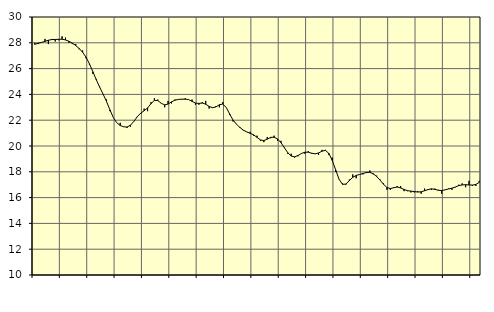
| Category | Piggar | Tillverkning o utvinning, energi o miljö, SNI 05-33, 35-39 |
|---|---|---|
| nan | 28 | 27.88 |
| 87.0 | 27.9 | 27.97 |
| 87.0 | 28 | 28.03 |
| 87.0 | 28.3 | 28.11 |
| nan | 27.9 | 28.2 |
| 88.0 | 28.3 | 28.25 |
| 88.0 | 28.1 | 28.26 |
| 88.0 | 28.2 | 28.27 |
| nan | 28.5 | 28.28 |
| 89.0 | 28.4 | 28.22 |
| 89.0 | 28 | 28.12 |
| 89.0 | 27.9 | 27.97 |
| nan | 27.9 | 27.79 |
| 90.0 | 27.5 | 27.56 |
| 90.0 | 27.4 | 27.27 |
| 90.0 | 26.8 | 26.89 |
| nan | 26.3 | 26.37 |
| 91.0 | 25.6 | 25.76 |
| 91.0 | 25.2 | 25.14 |
| 91.0 | 24.6 | 24.56 |
| nan | 24 | 24.02 |
| 92.0 | 23.6 | 23.45 |
| 92.0 | 22.7 | 22.8 |
| 92.0 | 22.2 | 22.2 |
| nan | 21.8 | 21.8 |
| 93.0 | 21.8 | 21.59 |
| 93.0 | 21.5 | 21.49 |
| 93.0 | 21.4 | 21.47 |
| nan | 21.5 | 21.61 |
| 94.0 | 21.9 | 21.91 |
| 94.0 | 22.3 | 22.27 |
| 94.0 | 22.5 | 22.55 |
| nan | 22.9 | 22.73 |
| 95.0 | 22.7 | 22.95 |
| 95.0 | 23.4 | 23.28 |
| 95.0 | 23.7 | 23.54 |
| nan | 23.6 | 23.52 |
| 96.0 | 23.3 | 23.31 |
| 96.0 | 23 | 23.19 |
| 96.0 | 23.5 | 23.25 |
| nan | 23.3 | 23.42 |
| 97.0 | 23.6 | 23.55 |
| 97.0 | 23.6 | 23.61 |
| 97.0 | 23.6 | 23.63 |
| nan | 23.7 | 23.63 |
| 98.0 | 23.6 | 23.6 |
| 98.0 | 23.6 | 23.46 |
| 98.0 | 23.2 | 23.33 |
| nan | 23.2 | 23.3 |
| 99.0 | 23.4 | 23.33 |
| 99.0 | 23.5 | 23.24 |
| 99.0 | 22.9 | 23.07 |
| nan | 23 | 22.97 |
| 0.0 | 23.1 | 23.03 |
| 0.0 | 23 | 23.2 |
| 0.0 | 23.4 | 23.25 |
| nan | 23 | 22.99 |
| 1.0 | 22.4 | 22.48 |
| 1.0 | 21.9 | 22.01 |
| 1.0 | 21.7 | 21.69 |
| nan | 21.4 | 21.44 |
| 2.0 | 21.2 | 21.23 |
| 2.0 | 21.1 | 21.09 |
| 2.0 | 21.1 | 20.98 |
| nan | 20.8 | 20.87 |
| 3.0 | 20.8 | 20.67 |
| 3.0 | 20.4 | 20.47 |
| 3.0 | 20.3 | 20.42 |
| nan | 20.7 | 20.53 |
| 4.0 | 20.6 | 20.67 |
| 4.0 | 20.8 | 20.68 |
| 4.0 | 20.4 | 20.55 |
| nan | 20.4 | 20.26 |
| 5.0 | 19.9 | 19.87 |
| 5.0 | 19.4 | 19.48 |
| 5.0 | 19.4 | 19.22 |
| nan | 19.1 | 19.16 |
| 6.0 | 19.2 | 19.26 |
| 6.0 | 19.4 | 19.42 |
| 6.0 | 19.4 | 19.52 |
| nan | 19.6 | 19.52 |
| 7.0 | 19.4 | 19.44 |
| 7.0 | 19.4 | 19.39 |
| 7.0 | 19.3 | 19.46 |
| nan | 19.7 | 19.6 |
| 8.0 | 19.7 | 19.66 |
| 8.0 | 19.3 | 19.43 |
| 8.0 | 19.1 | 18.88 |
| nan | 18 | 18.15 |
| 9.0 | 17.4 | 17.42 |
| 9.0 | 17.1 | 17.03 |
| 9.0 | 17 | 17.05 |
| nan | 17.4 | 17.32 |
| 10.0 | 17.8 | 17.57 |
| 10.0 | 17.5 | 17.72 |
| 10.0 | 17.8 | 17.79 |
| nan | 17.8 | 17.87 |
| 11.0 | 17.9 | 17.95 |
| 11.0 | 18.1 | 17.96 |
| 11.0 | 17.8 | 17.85 |
| nan | 17.7 | 17.63 |
| 12.0 | 17.4 | 17.35 |
| 12.0 | 17.1 | 17.03 |
| 12.0 | 16.6 | 16.78 |
| nan | 16.6 | 16.7 |
| 13.0 | 16.8 | 16.77 |
| 13.0 | 16.9 | 16.82 |
| 13.0 | 16.9 | 16.75 |
| nan | 16.5 | 16.63 |
| 14.0 | 16.5 | 16.54 |
| 14.0 | 16.4 | 16.5 |
| 14.0 | 16.4 | 16.47 |
| nan | 16.5 | 16.43 |
| 15.0 | 16.3 | 16.45 |
| 15.0 | 16.7 | 16.53 |
| 15.0 | 16.6 | 16.62 |
| nan | 16.6 | 16.68 |
| 16.0 | 16.7 | 16.64 |
| 16.0 | 16.6 | 16.57 |
| 16.0 | 16.3 | 16.55 |
| nan | 16.6 | 16.6 |
| 17.0 | 16.7 | 16.67 |
| 17.0 | 16.6 | 16.73 |
| 17.0 | 16.8 | 16.82 |
| nan | 17 | 16.93 |
| 18.0 | 17.1 | 16.98 |
| 18.0 | 16.8 | 17 |
| 18.0 | 17.3 | 16.98 |
| nan | 16.9 | 16.97 |
| 19.0 | 16.9 | 17.02 |
| 19.0 | 17.3 | 17.18 |